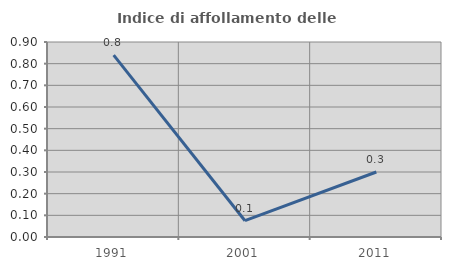
| Category | Indice di affollamento delle abitazioni  |
|---|---|
| 1991.0 | 0.839 |
| 2001.0 | 0.075 |
| 2011.0 | 0.3 |